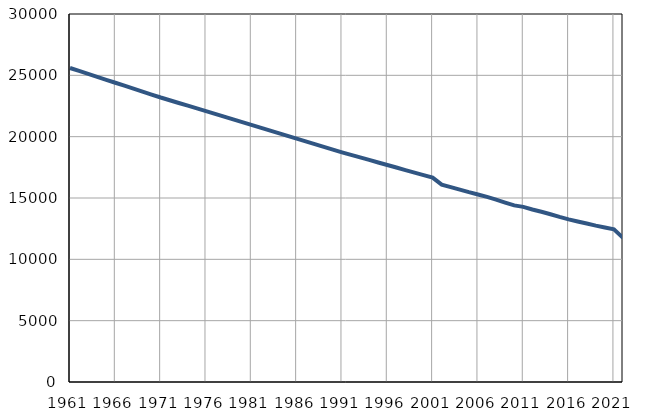
| Category | Број
становника |
|---|---|
| 1961.0 | 25599 |
| 1962.0 | 25358 |
| 1963.0 | 25118 |
| 1964.0 | 24877 |
| 1965.0 | 24636 |
| 1966.0 | 24396 |
| 1967.0 | 24155 |
| 1968.0 | 23914 |
| 1969.0 | 23673 |
| 1970.0 | 23433 |
| 1971.0 | 23192 |
| 1972.0 | 22969 |
| 1973.0 | 22747 |
| 1974.0 | 22524 |
| 1975.0 | 22301 |
| 1976.0 | 22079 |
| 1977.0 | 21856 |
| 1978.0 | 21633 |
| 1979.0 | 21410 |
| 1980.0 | 21188 |
| 1981.0 | 20965 |
| 1982.0 | 20741 |
| 1983.0 | 20517 |
| 1984.0 | 20293 |
| 1985.0 | 20069 |
| 1986.0 | 19844 |
| 1987.0 | 19620 |
| 1988.0 | 19396 |
| 1989.0 | 19172 |
| 1990.0 | 18948 |
| 1991.0 | 18724 |
| 1992.0 | 18517 |
| 1993.0 | 18310 |
| 1994.0 | 18104 |
| 1995.0 | 17897 |
| 1996.0 | 17690 |
| 1997.0 | 17483 |
| 1998.0 | 17276 |
| 1999.0 | 17069 |
| 2000.0 | 16863 |
| 2001.0 | 16656 |
| 2002.0 | 16089 |
| 2003.0 | 15882 |
| 2004.0 | 15688 |
| 2005.0 | 15476 |
| 2006.0 | 15282 |
| 2007.0 | 15087 |
| 2008.0 | 14872 |
| 2009.0 | 14629 |
| 2010.0 | 14395 |
| 2011.0 | 14275 |
| 2012.0 | 14063 |
| 2013.0 | 13877 |
| 2014.0 | 13675 |
| 2015.0 | 13456 |
| 2016.0 | 13258 |
| 2017.0 | 13080 |
| 2018.0 | 12919 |
| 2019.0 | 12747 |
| 2020.0 | 12595 |
| 2021.0 | 12442 |
| 2022.0 | 11754 |